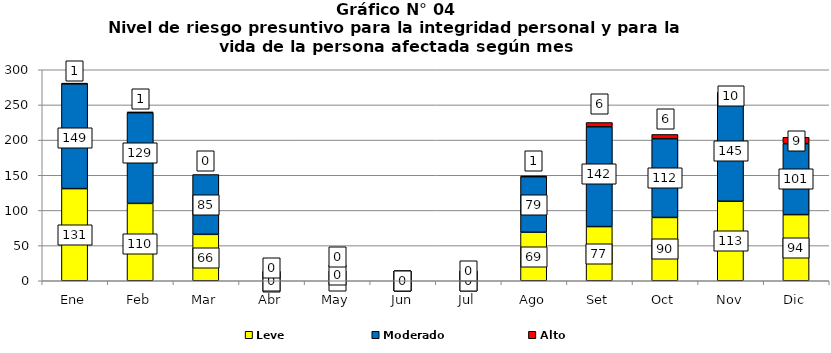
| Category | Leve | Moderado | Alto |
|---|---|---|---|
| Ene | 131 | 149 | 1 |
| Feb | 110 | 129 | 1 |
| Mar | 66 | 85 | 0 |
| Abr | 0 | 0 | 0 |
| May | 0 | 0 | 0 |
| Jun | 0 | 0 | 0 |
| Jul | 0 | 0 | 0 |
| Ago | 69 | 79 | 1 |
| Set | 77 | 142 | 6 |
| Oct | 90 | 112 | 6 |
| Nov | 113 | 145 | 10 |
| Dic | 94 | 101 | 9 |